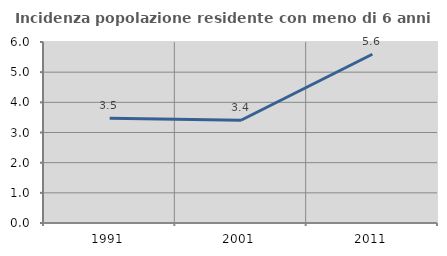
| Category | Incidenza popolazione residente con meno di 6 anni |
|---|---|
| 1991.0 | 3.476 |
| 2001.0 | 3.407 |
| 2011.0 | 5.593 |